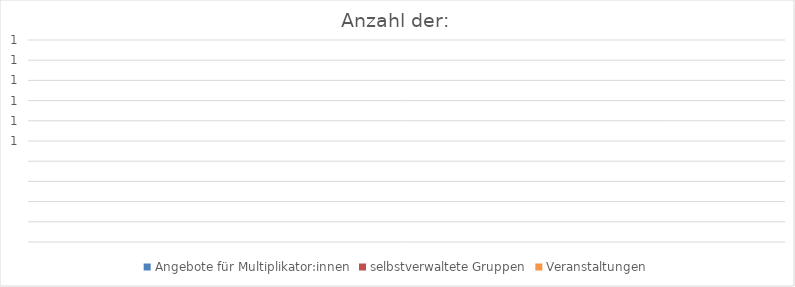
| Category | Angebote für Multiplikator:innen | selbstverwaltete Gruppen | Veranstaltungen |
|---|---|---|---|
| 0 | 0 | 0 | 0 |